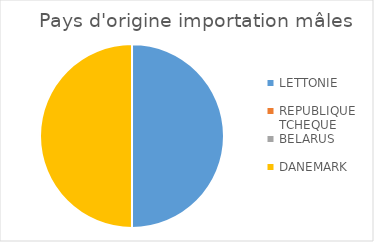
| Category | Series 0 |
|---|---|
| LETTONIE | 1 |
| REPUBLIQUE TCHEQUE | 0 |
| BELARUS | 0 |
| DANEMARK | 1 |